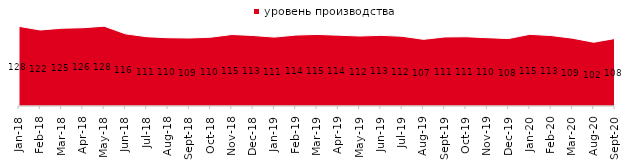
| Category | уровень производства |
|---|---|
| 2018-01-01 | 127.8 |
| 2018-02-01 | 121.95 |
| 2018-03-01 | 124.8 |
| 2018-04-01 | 125.6 |
| 2018-05-01 | 128.1 |
| 2018-06-01 | 115.8 |
| 2018-07-01 | 111.15 |
| 2018-08-01 | 109.55 |
| 2018-09-01 | 109.1 |
| 2018-10-01 | 110.35 |
| 2018-11-01 | 114.721 |
| 2018-12-01 | 113.1 |
| 2019-01-01 | 110.55 |
| 2019-02-01 | 113.8 |
| 2019-03-01 | 114.868 |
| 2019-04-01 | 113.663 |
| 2019-05-01 | 112.283 |
| 2019-06-01 | 113.367 |
| 2019-07-01 | 111.881 |
| 2019-08-01 | 106.943 |
| 2019-09-01 | 110.792 |
| 2019-10-01 | 111.139 |
| 2019-11-01 | 109.604 |
| 2019-12-01 | 108.218 |
| 2020-01-01 | 115 |
| 2020-02-01 | 113.069 |
| 2020-03-01 | 108.825 |
| 2020-08-01 | 102.284 |
| 2020-09-01 | 108.362 |